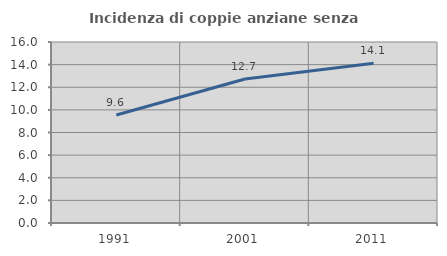
| Category | Incidenza di coppie anziane senza figli  |
|---|---|
| 1991.0 | 9.55 |
| 2001.0 | 12.727 |
| 2011.0 | 14.123 |